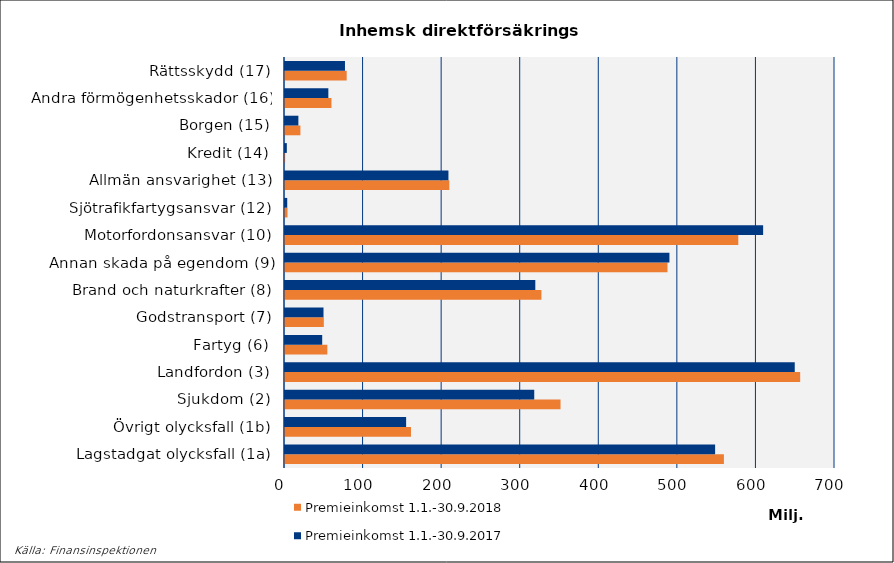
| Category | Premieinkomst |
|---|---|
| Lagstadgat olycksfall (1a) | 547402.07 |
| Övrigt olycksfall (1b) | 154166.375 |
| Sjukdom (2) | 317214.574 |
| Landfordon (3) | 648767.502 |
| Fartyg (6) | 47343.236 |
| Godstransport (7) | 48993.336 |
| Brand och naturkrafter (8) | 318572.352 |
| Annan skada på egendom (9) | 489264.942 |
| Motorfordonsansvar (10) | 608528.345 |
| Sjötrafikfartygsansvar (12) | 2837.072 |
| Allmän ansvarighet (13) | 208009.585 |
| Kredit (14) | 2320.877 |
| Borgen (15) | 17025.706 |
| Andra förmögenhetsskador (16) | 55174.175 |
| Rättsskydd (17) | 76330.184 |